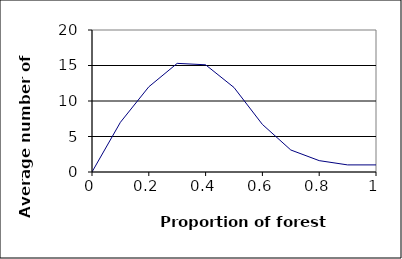
| Category | Series 0 |
|---|---|
| 1.0 | 1 |
| 0.9 | 1 |
| 0.8 | 1.6 |
| 0.7000000000000001 | 3.1 |
| 0.6000000000000001 | 6.7 |
| 0.5000000000000001 | 11.9 |
| 0.40000000000000013 | 15.1 |
| 0.30000000000000016 | 15.3 |
| 0.20000000000000015 | 12 |
| 0.10000000000000014 | 7 |
| 0.0 | 0 |